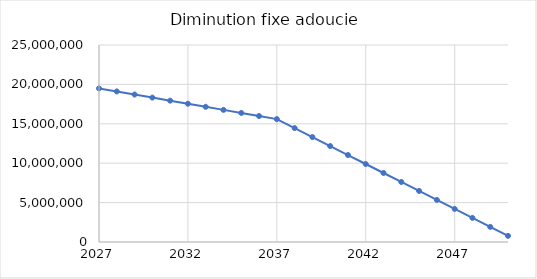
| Category | Diminution fixe adoucie |
|---|---|
| 2027.0 | 19495584 |
| 2028.0 | 19105672.32 |
| 2029.0 | 18715760.64 |
| 2030.0 | 18325848.96 |
| 2031.0 | 17935937.28 |
| 2032.0 | 17546025.6 |
| 2033.0 | 17156113.92 |
| 2034.0 | 16766202.24 |
| 2035.0 | 16376290.56 |
| 2036.0 | 15986378.88 |
| 2037.0 | 15596467.2 |
| 2038.0 | 14456677.415 |
| 2039.0 | 13316887.631 |
| 2040.0 | 12177097.846 |
| 2041.0 | 11037308.062 |
| 2042.0 | 9897518.277 |
| 2043.0 | 8757728.492 |
| 2044.0 | 7617938.708 |
| 2045.0 | 6478148.923 |
| 2046.0 | 5338359.138 |
| 2047.0 | 4198569.354 |
| 2048.0 | 3058779.569 |
| 2049.0 | 1918989.785 |
| 2050.0 | 779200 |